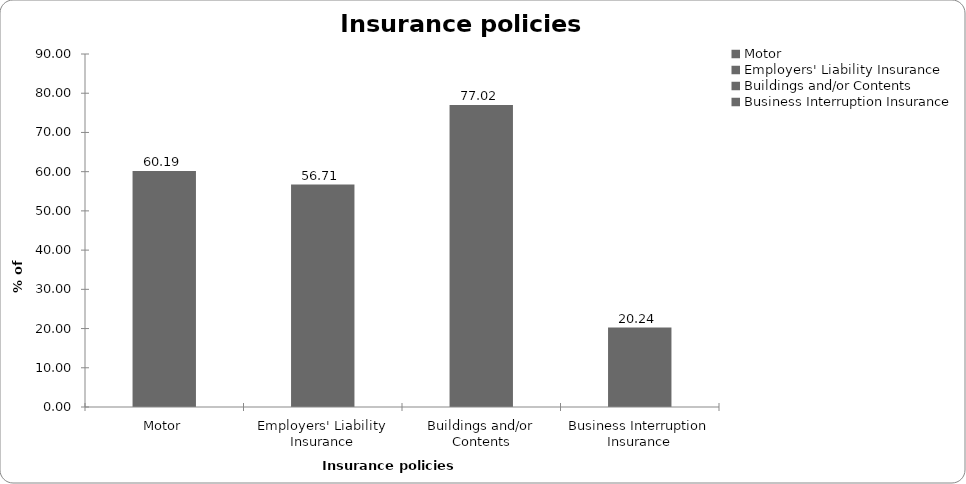
| Category | Series 0 |
|---|---|
| Motor | 60.187 |
| Employers' Liability Insurance | 56.713 |
| Buildings and/or Contents | 77.021 |
| Business Interruption Insurance | 20.24 |